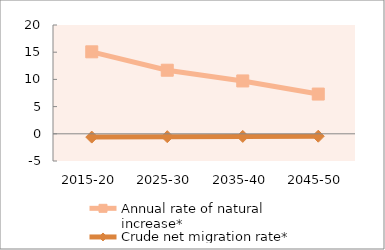
| Category | Annual rate of natural increase* | Crude net migration rate* |
|---|---|---|
| 2015-20 | 15.069 | -0.605 |
| 2025-30 | 11.686 | -0.533 |
| 2035-40 | 9.717 | -0.481 |
| 2045-50 | 7.307 | -0.444 |